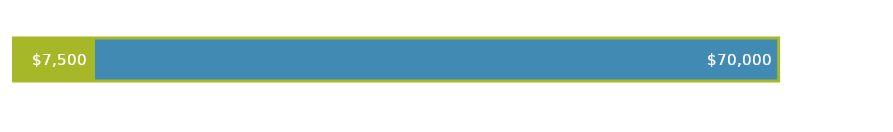
| Category | TOTAL DE PROVISÃO | DESPESAS TOTAIS |
|---|---|---|
| 0 | 70000 | 7500 |